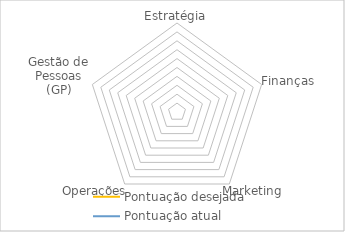
| Category | Pontuação desejada | Pontuação atual |
|---|---|---|
| 0 | 0 | 0 |
| 1 | 0 | 0 |
| 2 | 0 | 0 |
| 3 | 0 | 0 |
| 4 | 0 | 0 |